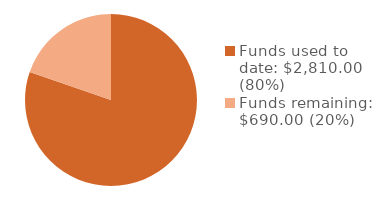
| Category | Series 0 |
|---|---|
| Funds used to date: $2,810.00 (80%) | 2810 |
| Funds remaining: $690.00 (20%) | 690 |